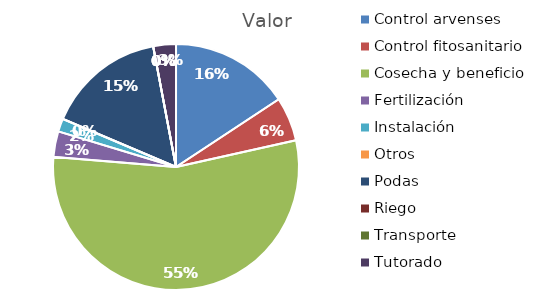
| Category | Valor |
|---|---|
| Control arvenses | 28173758 |
| Control fitosanitario | 10379820 |
| Cosecha y beneficio | 98199388 |
| Fertilización | 6039168 |
| Instalación | 3091477 |
| Otros | 0 |
| Podas | 27994060 |
| Riego | 0 |
| Transporte | 0 |
| Tutorado | 5347180 |